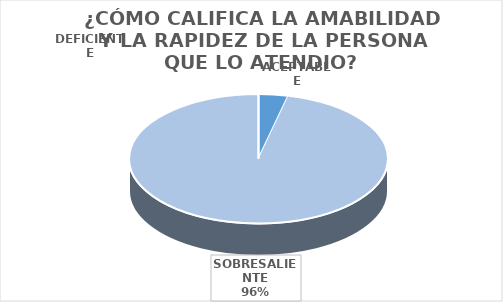
| Category | Series 0 |
|---|---|
| DEFICIENTE | 0 |
| ACEPTABLE | 3 |
| SOBRESALIENTE | 78 |